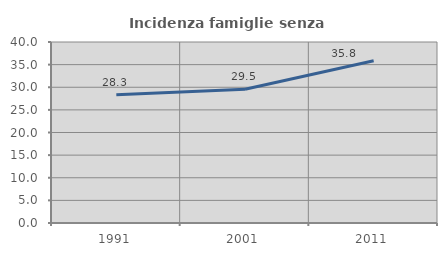
| Category | Incidenza famiglie senza nuclei |
|---|---|
| 1991.0 | 28.341 |
| 2001.0 | 29.541 |
| 2011.0 | 35.842 |